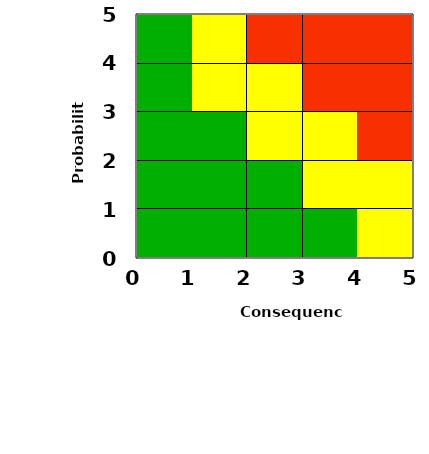
| Category | Series 0 |
|---|---|
| 2.6666666666666665 | 0 |